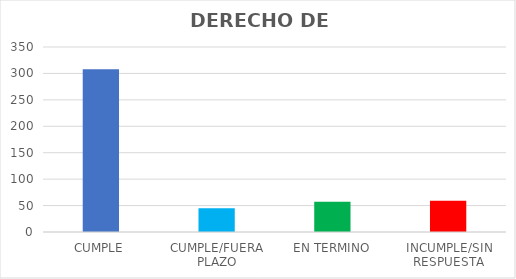
| Category | TOTAL |
|---|---|
| CUMPLE | 308 |
| CUMPLE/FUERA PLAZO | 45 |
| EN TERMINO | 57 |
| INCUMPLE/SIN RESPUESTA | 59 |